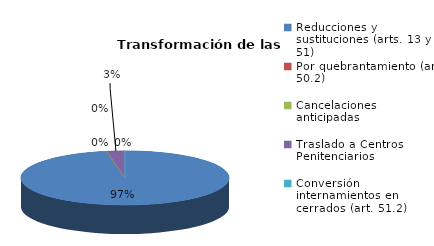
| Category | Series 0 |
|---|---|
| Reducciones y sustituciones (arts. 13 y 51) | 35 |
| Por quebrantamiento (art. 50.2) | 0 |
| Cancelaciones anticipadas | 0 |
| Traslado a Centros Penitenciarios | 1 |
| Conversión internamientos en cerrados (art. 51.2) | 0 |